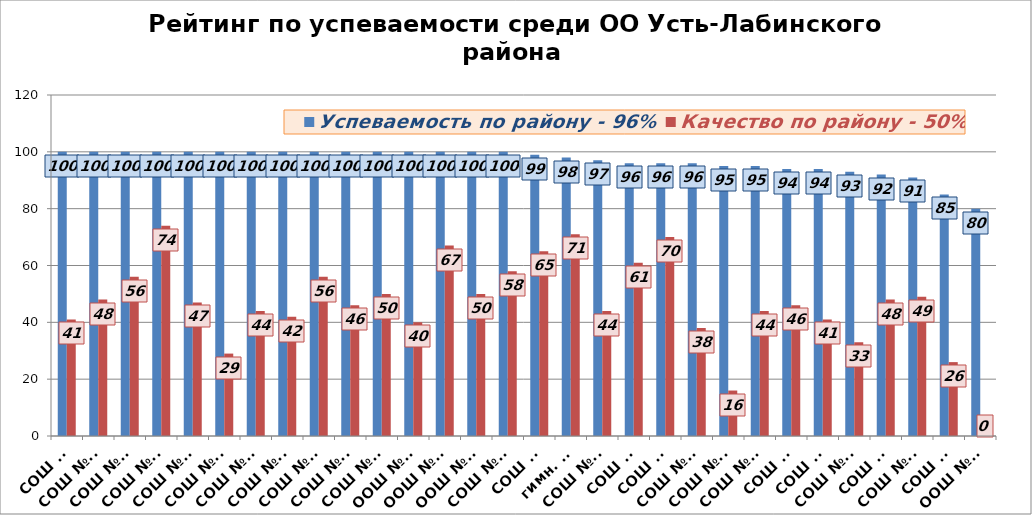
| Category | Успеваемость по району - 96% | Качество по району - 50% |
|---|---|---|
| СОШ №8 | 100 | 41 |
| СОШ №12 | 100 | 48 |
| СОШ №13 | 100 | 56 |
| СОШ №14 | 100 | 74 |
| СОШ №16 | 100 | 47 |
| СОШ №17 | 100 | 29 |
| СОШ №18 | 100 | 44 |
| СОШ №20 | 100 | 42 |
| СОШ №21 | 100 | 56 |
| СОШ №22 | 100 | 46 |
| СОШ №23 | 100 | 50 |
| ООШ №27 | 100 | 40 |
| ООШ №28 | 100 | 67 |
| ООШ №31 | 100 | 50 |
| СОШ №36 | 100 | 58 |
| СОШ №2 | 99 | 65 |
| гимн. №5 | 98 | 71 |
| СОШ №19 | 97 | 44 |
| СОШ №1 | 96 | 61 |
| СОШ №3 | 96 | 70 |
| СОШ №15 | 96 | 38 |
| СОШ №10 | 95 | 16 |
| СОШ №11 | 95 | 44 |
| СОШ №6 | 94 | 46 |
| СОШ №9 | 94 | 41 |
| СОШ №24 | 93 | 33 |
| СОШ №7 | 92 | 48 |
| СОШ №25 | 91 | 49 |
| СОШ №4 | 85 | 26 |
| ООШ №26 | 80 | 0 |